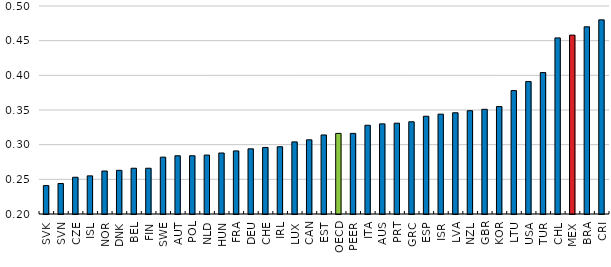
| Category | 2016 or latest year |
|---|---|
| SVK | 0.241 |
| SVN | 0.244 |
| CZE | 0.253 |
| ISL | 0.255 |
| NOR | 0.262 |
| DNK | 0.263 |
| BEL | 0.266 |
| FIN | 0.266 |
| SWE | 0.282 |
| AUT | 0.284 |
| POL | 0.284 |
| NLD | 0.285 |
| HUN | 0.288 |
| FRA | 0.291 |
| DEU | 0.294 |
| CHE | 0.296 |
| IRL | 0.297 |
| LUX | 0.304 |
| CAN | 0.307 |
| EST | 0.314 |
| OECD | 0.316 |
| PEER | 0.316 |
| ITA | 0.328 |
| AUS | 0.33 |
| PRT | 0.331 |
| GRC | 0.333 |
| ESP | 0.341 |
| ISR | 0.344 |
| LVA | 0.346 |
| NZL | 0.349 |
| GBR | 0.351 |
| KOR | 0.355 |
| LTU | 0.378 |
| USA | 0.391 |
| TUR | 0.404 |
| CHL | 0.454 |
| MEX | 0.458 |
| BRA | 0.47 |
| CRI | 0.48 |